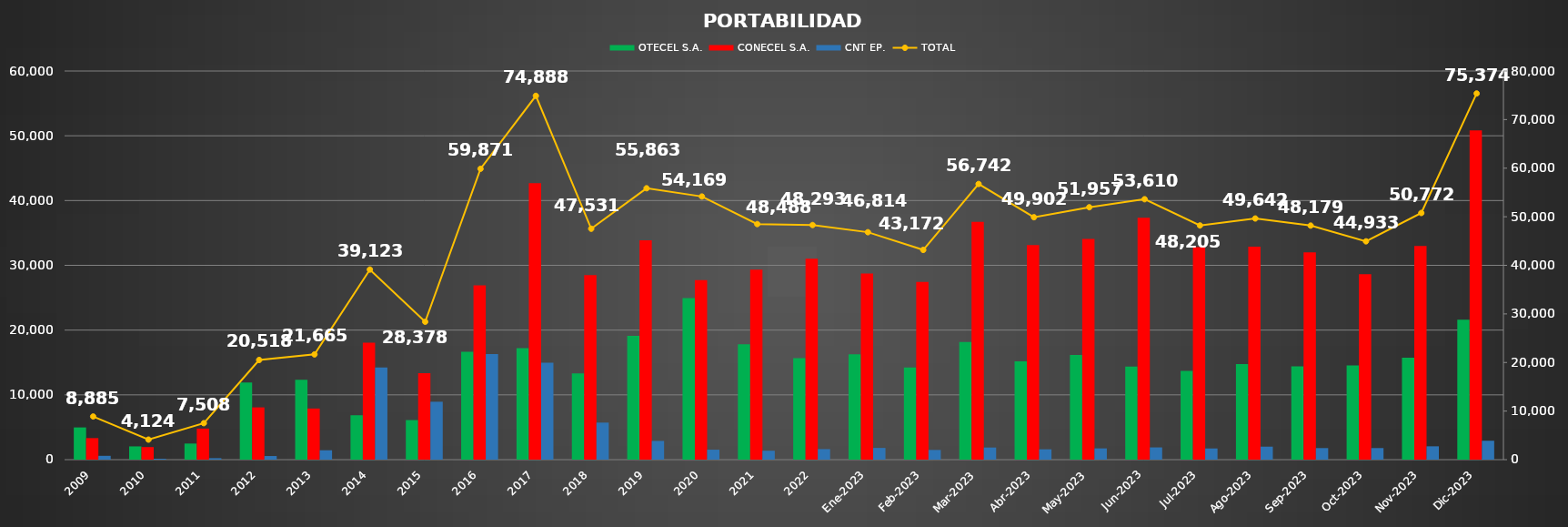
| Category | OTECEL S.A. | CONECEL S.A. | CNT EP. |
|---|---|---|---|
| 2009 | 4973 | 3324 | 588 |
| 2010 | 2045 | 1939 | 140 |
| 2011 | 2484 | 4796 | 228 |
| 2012 | 11894 | 8067 | 557 |
| 2013 | 12323 | 7893 | 1449 |
| 2014 | 6853 | 18039 | 14231 |
| 2015 | 6105 | 13334 | 8939 |
| 2016 | 16653 | 26907 | 16311 |
| 2017 | 17228 | 42694 | 14966 |
| 2018 | 13309 | 28504 | 5718 |
| 2019 | 19116 | 33857 | 2890 |
| 2020 | 24933 | 27700 | 1536 |
| 2021 | 17795 | 29321 | 1372 |
| 2022 | 15655 | 31012 | 1626 |
| Ene-2023 | 16278 | 28730 | 1806 |
| Feb-2023 | 14237 | 27438 | 1497 |
| Mar-2023 | 18159 | 36713 | 1870 |
| Abr-2023 | 15167 | 33140 | 1595 |
| May-2023 | 16147 | 34074 | 1736 |
| Jun-2023 | 14369 | 37353 | 1888 |
| Jul-2023 | 13685 | 32795 | 1725 |
| Ago-2023 | 14739 | 32898 | 2005 |
| Sep-2023 | 14396 | 31999 | 1784 |
| Oct-2023 | 14528 | 28619 | 1786 |
| Nov-2023 | 15737 | 32978 | 2057 |
| Dic-2023 | 21620 | 50836 | 2918 |